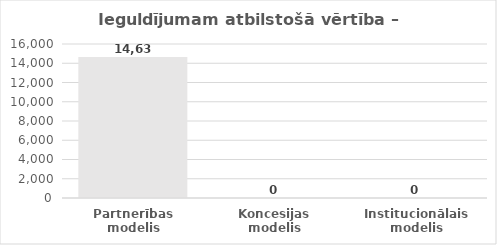
| Category | Series 0 |
|---|---|
| Partnerības modelis | 14637.757 |
| Koncesijas modelis | 0 |
| Institucionālais modelis | 0 |